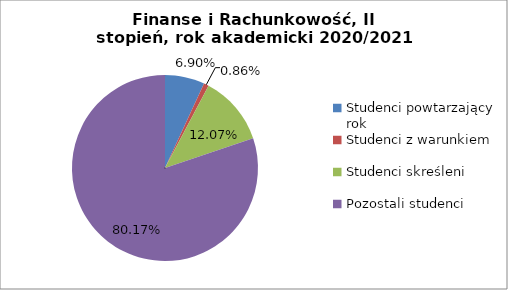
| Category | Series 0 |
|---|---|
| Studenci powtarzający rok | 8 |
| Studenci z warunkiem | 1 |
| Studenci skreśleni | 14 |
| Pozostali studenci | 93 |